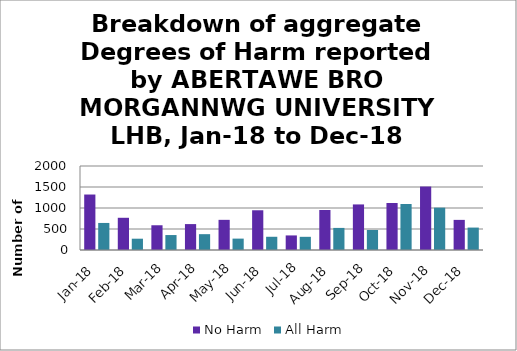
| Category | No Harm | All Harm |
|---|---|---|
| Jan-18 | 1321 | 644 |
| Feb-18 | 767 | 269 |
| Mar-18 | 589 | 356 |
| Apr-18 | 617 | 377 |
| May-18 | 718 | 271 |
| Jun-18 | 946 | 315 |
| Jul-18 | 347 | 314 |
| Aug-18 | 953 | 526 |
| Sep-18 | 1085 | 477 |
| Oct-18 | 1119 | 1095 |
| Nov-18 | 1511 | 1008 |
| Dec-18 | 717 | 534 |